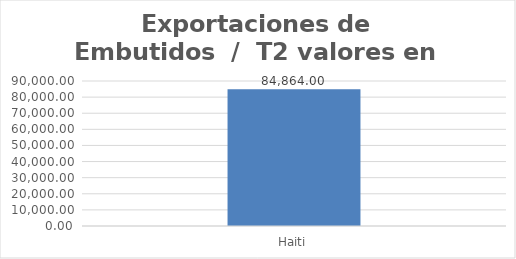
| Category | Valor US  |
|---|---|
| Haiti | 84864 |